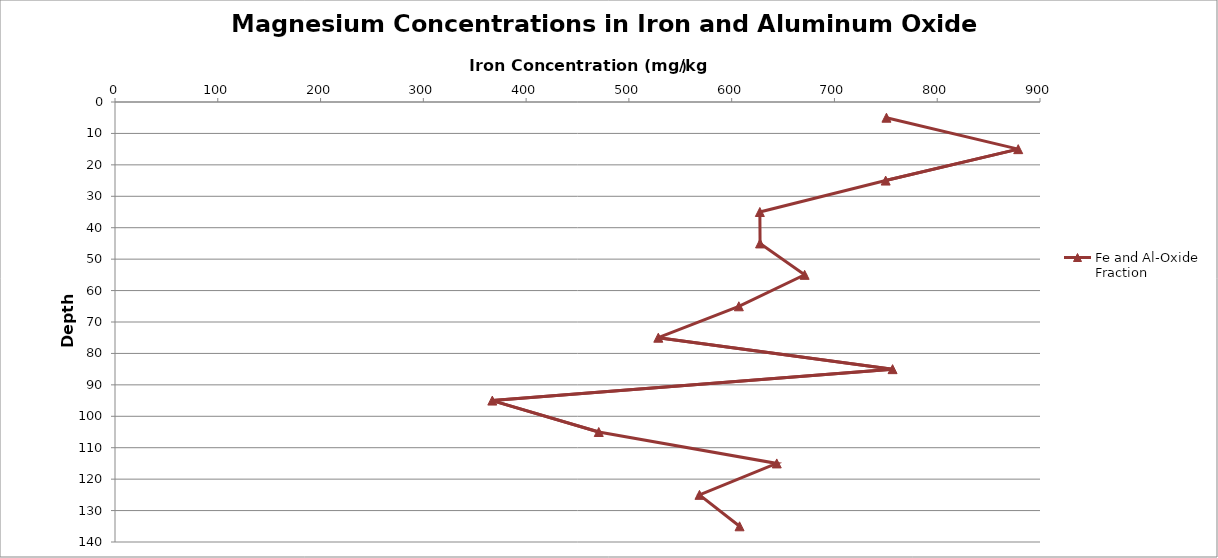
| Category | Fe and Al-Oxide Fraction |
|---|---|
| 750.5977771463887 | 5 |
| 878.8218149582393 | 15 |
| 749.8396734746195 | 25 |
| 627.4298570947846 | 35 |
| 627.6296706696181 | 45 |
| 670.9974254558639 | 55 |
| 606.9779589821837 | 65 |
| 528.6103446983041 | 75 |
| 756.5569165334721 | 85 |
| 367.10487291155823 | 95 |
| 470.6880386283927 | 105 |
| 643.8679075309188 | 115 |
| 568.672523757492 | 125 |
| 607.6795291734425 | 135 |